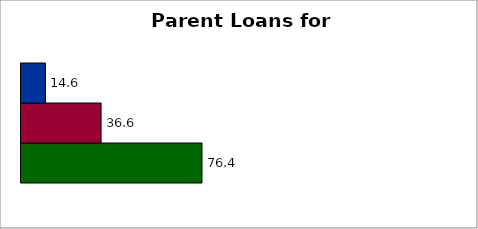
| Category | State | SREB states | 50 states and D.C. |
|---|---|---|---|
| 0 | 76.442 | 36.614 | 14.647 |